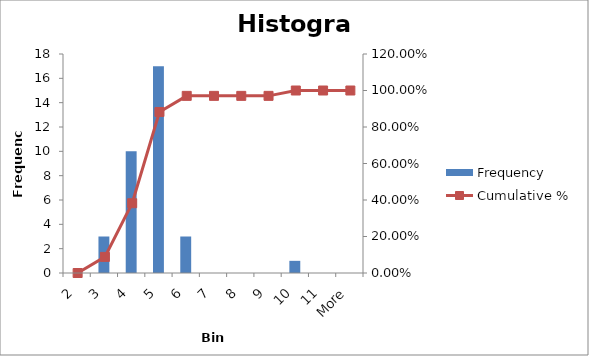
| Category | Frequency |
|---|---|
| 2 | 0 |
| 3 | 3 |
| 4 | 10 |
| 5 | 17 |
| 6 | 3 |
| 7 | 0 |
| 8 | 0 |
| 9 | 0 |
| 10 | 1 |
| 11 | 0 |
| More | 0 |